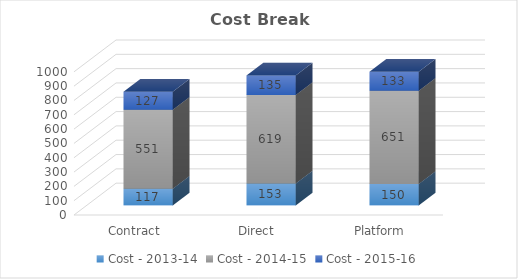
| Category | Cost - 2013-14 | Cost - 2014-15 | Cost - 2015-16 |
|---|---|---|---|
| 0 | 117 | 551 | 127 |
| 1 | 153 | 619 | 135 |
| 2 | 150 | 651 | 133 |